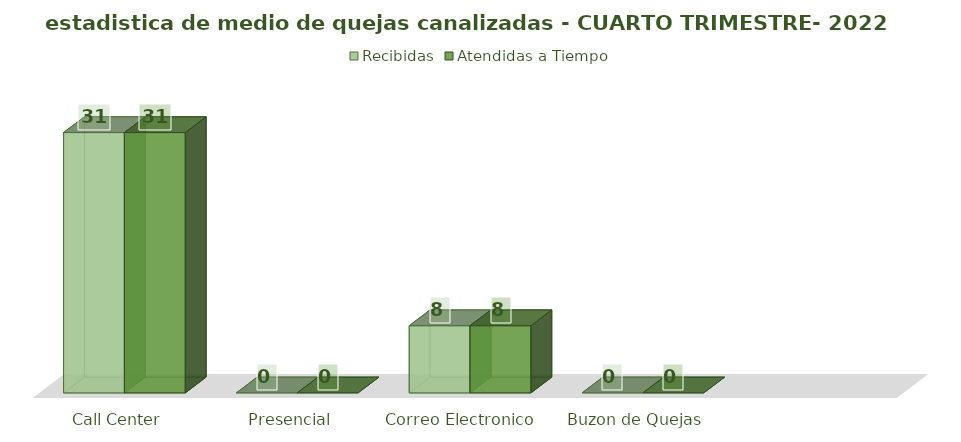
| Category | Recibidas | Atendidas a Tiempo |
|---|---|---|
| Call Center | 31 | 31 |
| Presencial | 0 | 0 |
| Correo Electronico  | 8 | 8 |
| Buzon de Quejas | 0 | 0 |